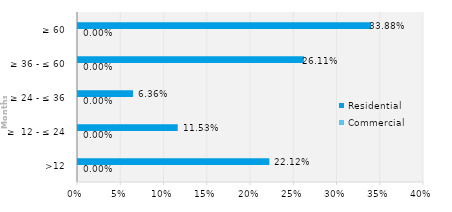
| Category | Commercial | Residential |
|---|---|---|
| >12 | 0 | 0.221 |
| ≥  12 - ≤ 24 | 0 | 0.115 |
| ≥ 24 - ≤ 36 | 0 | 0.064 |
| ≥ 36 - ≤ 60 | 0 | 0.261 |
| ≥ 60 | 0 | 0.339 |